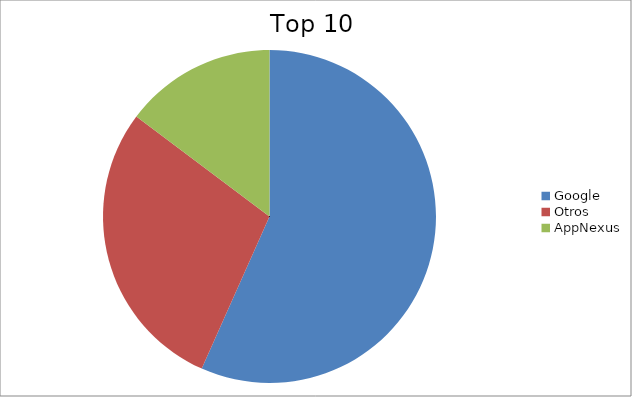
| Category | Series 0 |
|---|---|
| Google | 56.67 |
| Otros | 28.58 |
| AppNexus | 14.75 |